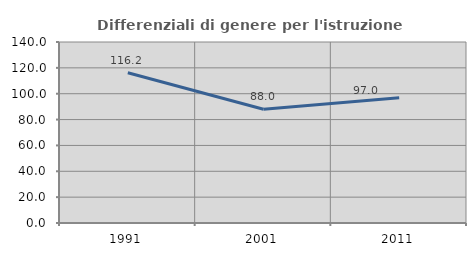
| Category | Differenziali di genere per l'istruzione superiore |
|---|---|
| 1991.0 | 116.215 |
| 2001.0 | 87.964 |
| 2011.0 | 96.965 |